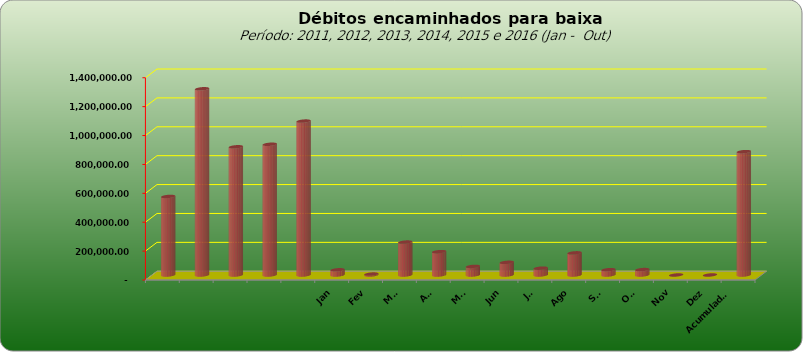
| Category |  543.796,20  |
|---|---|
|  | 543796.2 |
|  | 1289053.69 |
|  | 887573.08 |
|  | 905052.31 |
|  | 1065434.28 |
| Jan | 35964.03 |
| Fev | 6417.54 |
| Mar | 227804.72 |
| Abr | 161576.79 |
| Mai | 59557.82 |
| Jun | 87752.76 |
| Jul | 47447.42 |
| Ago | 153259.03 |
| Set | 36638.73 |
| Out | 37444.99 |
| Nov | 0 |
| Dez | 0 |
| Acumulado
2016 | 853863.83 |